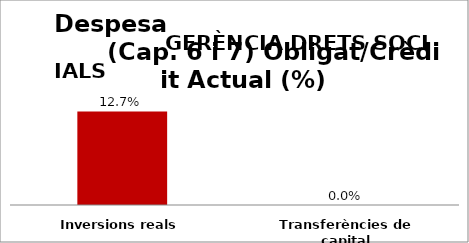
| Category | Series 0 |
|---|---|
| Inversions reals | 0.127 |
| Transferències de capital | 0 |